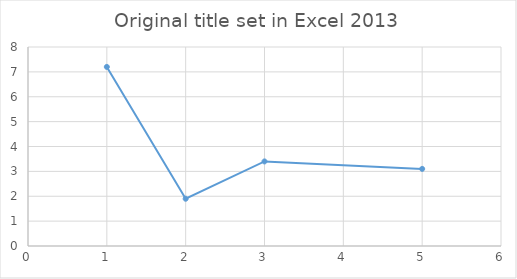
| Category | Series 0 |
|---|---|
| 1.0 | 7.2 |
| 2.0 | 1.9 |
| 3.0 | 3.4 |
| 5.0 | 3.1 |